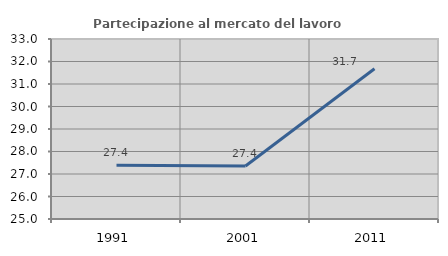
| Category | Partecipazione al mercato del lavoro  femminile |
|---|---|
| 1991.0 | 27.394 |
| 2001.0 | 27.356 |
| 2011.0 | 31.68 |